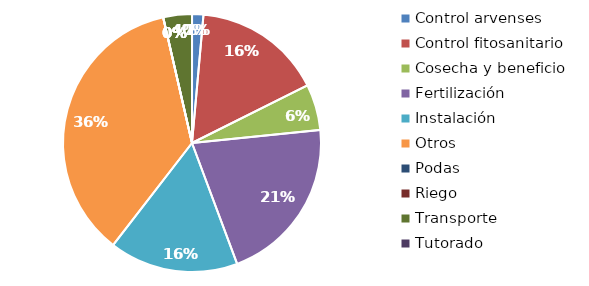
| Category | Valor |
|---|---|
| Control arvenses | 198000 |
| Control fitosanitario | 2255500 |
| Cosecha y beneficio | 800000 |
| Fertilización | 2912800 |
| Instalación | 2250000 |
| Otros | 5000000 |
| Podas | 0 |
| Riego | 0 |
| Transporte | 500000 |
| Tutorado | 0 |